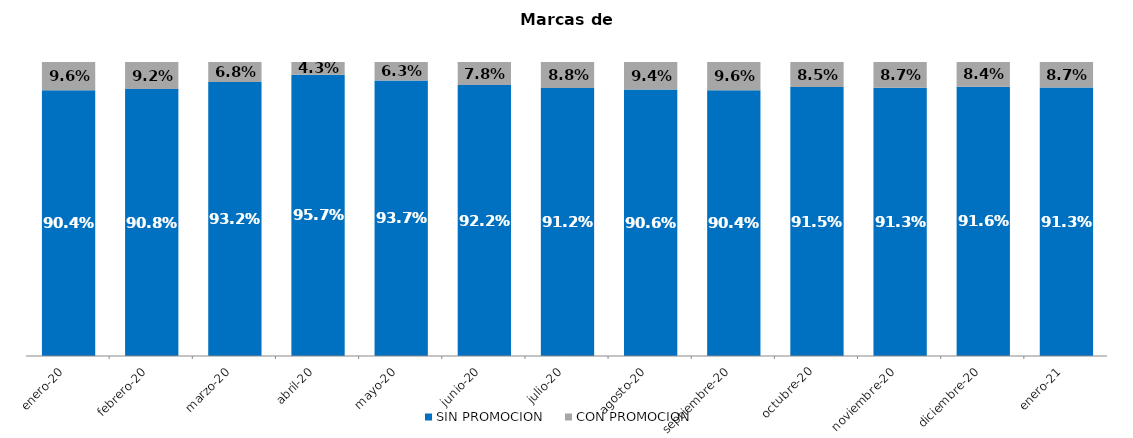
| Category | SIN PROMOCION   | CON PROMOCION   |
|---|---|---|
| 2020-01-01 | 0.904 | 0.096 |
| 2020-02-01 | 0.908 | 0.092 |
| 2020-03-01 | 0.932 | 0.068 |
| 2020-04-01 | 0.957 | 0.043 |
| 2020-05-01 | 0.937 | 0.063 |
| 2020-06-01 | 0.922 | 0.078 |
| 2020-07-01 | 0.912 | 0.088 |
| 2020-08-01 | 0.906 | 0.094 |
| 2020-09-01 | 0.904 | 0.096 |
| 2020-10-01 | 0.915 | 0.085 |
| 2020-11-01 | 0.913 | 0.087 |
| 2020-12-01 | 0.916 | 0.084 |
| 2021-01-01 | 0.913 | 0.087 |